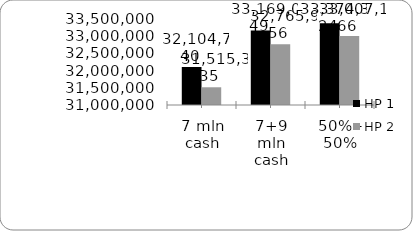
| Category | HP 1 | HP 2 |
|---|---|---|
| 7 mln cash | 32104740.479 | 31515334.854 |
| 7+9 mln cash | 33169048.529 | 32765955.982 |
| 50% - 50% | 33374324.165 | 33007166.266 |